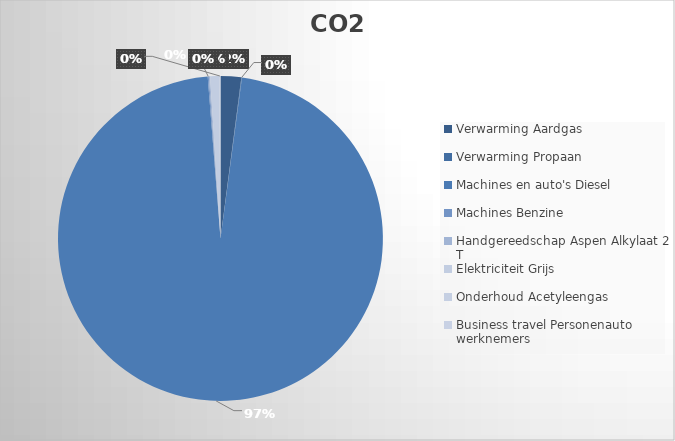
| Category | Ton CO2 | Series 1 |
|---|---|---|
| 0 | 9.608 |  |
| 1 | 0.254 |  |
| 2 | 451.748 |  |
| 3 | 0.513 |  |
| 4 | 0.557 |  |
| 5 | 4.23 |  |
| 6 | 0.572 |  |
| 7 | 0 |  |